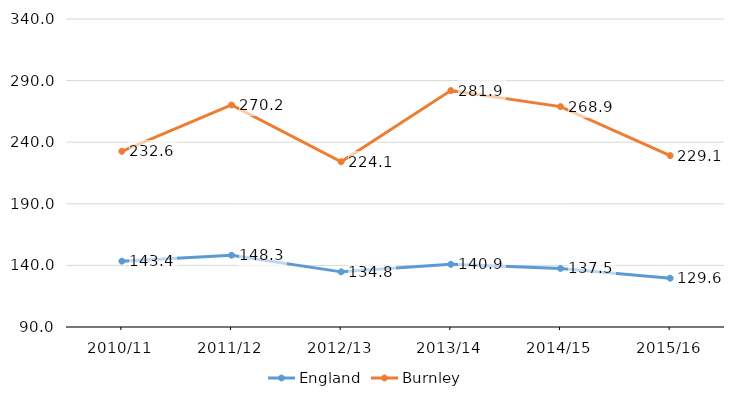
| Category | England | Burnley |
|---|---|---|
| 2010/11 | 143.445 | 232.637 |
| 2011/12 | 148.254 | 270.224 |
| 2012/13 | 134.757 | 224.118 |
| 2013/14 | 140.856 | 281.904 |
| 2014/15 | 137.498 | 268.908 |
| 2015/16 | 129.631 | 229.113 |